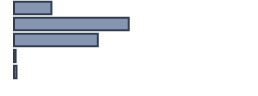
| Category | Percentatge |
|---|---|
| 0 | 15.593 |
| 1 | 47.797 |
| 2 | 34.915 |
| 3 | 0.678 |
| 4 | 1.017 |